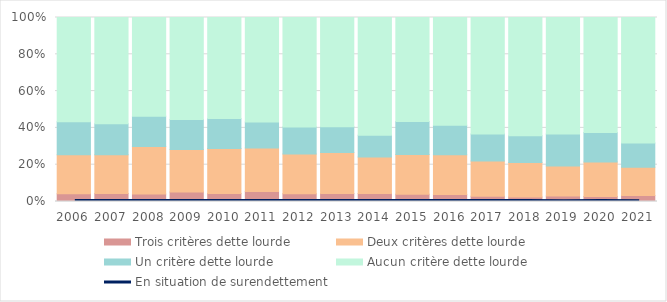
| Category | Trois critères dette lourde | Deux critères dette lourde | Un critère dette lourde | Aucun critère dette lourde |
|---|---|---|---|---|
| 2006 | 0.042 | 0.211 | 0.179 | 0.564 |
| 2007 | 0.043 | 0.21 | 0.168 | 0.575 |
| 2008 | 0.041 | 0.257 | 0.164 | 0.536 |
| 2009 | 0.051 | 0.232 | 0.163 | 0.554 |
| 2010 | 0.044 | 0.244 | 0.164 | 0.549 |
| 2011 | 0.054 | 0.236 | 0.141 | 0.567 |
| 2012 | 0.042 | 0.216 | 0.146 | 0.595 |
| 2013 | 0.043 | 0.223 | 0.139 | 0.593 |
| 2014 | 0.043 | 0.199 | 0.118 | 0.639 |
| 2015 | 0.039 | 0.212 | 0.177 | 0.555 |
| 2016 | 0.038 | 0.216 | 0.161 | 0.586 |
| 2017 | 0.029 | 0.191 | 0.146 | 0.631 |
| 2018 | 0.025 | 0.187 | 0.145 | 0.641 |
| 2019 | 0.03 | 0.16 | 0.171 | 0.622 |
| 2020 | 0.027 | 0.188 | 0.16 | 0.624 |
| 2021 | 0.032 | 0.152 | 0.131 | 0.677 |